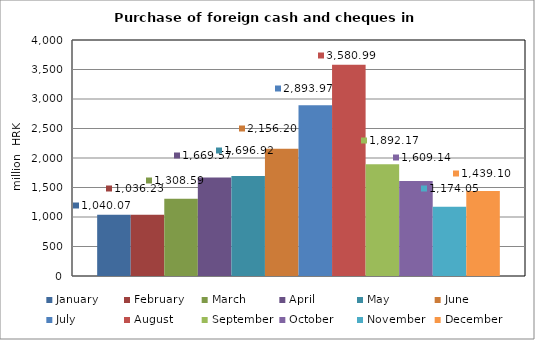
| Category | January | February | March | April | May | June | July | August | September | October | November | December |
|---|---|---|---|---|---|---|---|---|---|---|---|---|
| 0 | 1040.071 | 1036.228 | 1308.59 | 1669.574 | 1696.922 | 2156.204 | 2893.973 | 3580.994 | 1892.17 | 1609.142 | 1174.047 | 1439.103 |